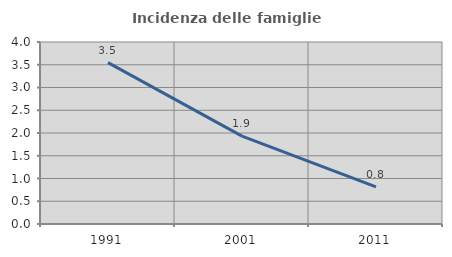
| Category | Incidenza delle famiglie numerose |
|---|---|
| 1991.0 | 3.547 |
| 2001.0 | 1.93 |
| 2011.0 | 0.814 |